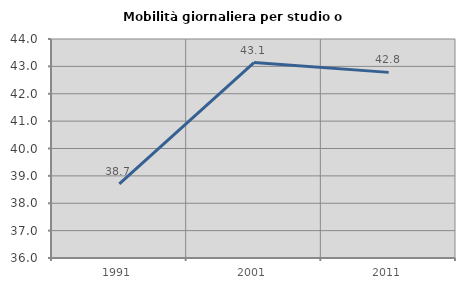
| Category | Mobilità giornaliera per studio o lavoro |
|---|---|
| 1991.0 | 38.71 |
| 2001.0 | 43.137 |
| 2011.0 | 42.781 |